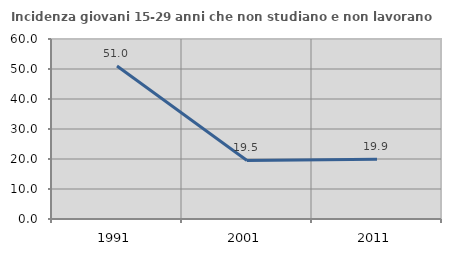
| Category | Incidenza giovani 15-29 anni che non studiano e non lavorano  |
|---|---|
| 1991.0 | 50.976 |
| 2001.0 | 19.521 |
| 2011.0 | 19.912 |